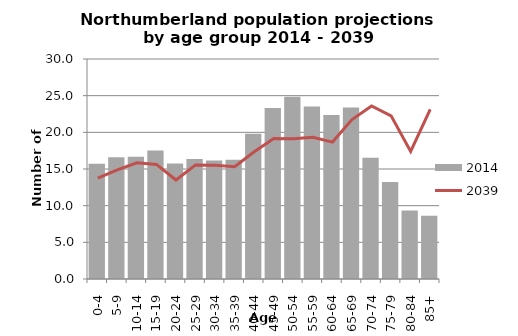
| Category | 2014 |
|---|---|
| 0-4 | 15.703 |
| 5-9 | 16.588 |
| 10-14 | 16.656 |
| 15-19 | 17.533 |
| 20-24 | 15.758 |
| 25-29 | 16.365 |
| 30-34 | 16.146 |
| 35-39 | 16.246 |
| 40-44 | 19.815 |
| 45-49 | 23.306 |
| 50-54 | 24.85 |
| 55-59 | 23.509 |
| 60-64 | 22.368 |
| 65-69 | 23.387 |
| 70-74 | 16.53 |
| 75-79 | 13.239 |
| 80-84 | 9.352 |
| 85+ | 8.636 |